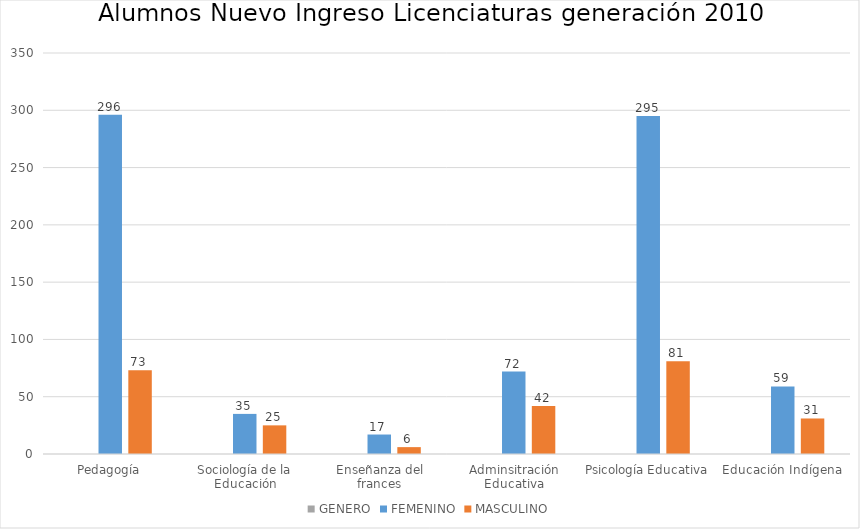
| Category | GENERO | FEMENINO | MASCULINO |
|---|---|---|---|
| Pedagogía |  | 296 | 73 |
| Sociología de la Educación |  | 35 | 25 |
| Enseñanza del frances |  | 17 | 6 |
| Adminsitración Educativa |  | 72 | 42 |
| Psicología Educativa |  | 295 | 81 |
| Educación Indígena |  | 59 | 31 |